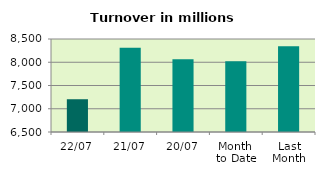
| Category | Series 0 |
|---|---|
| 22/07 | 7204.561 |
| 21/07 | 8310.215 |
| 20/07 | 8064.291 |
| Month 
to Date | 8021.893 |
| Last
Month | 8344.334 |